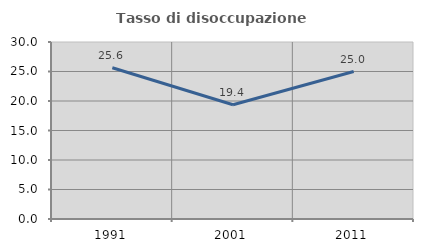
| Category | Tasso di disoccupazione giovanile  |
|---|---|
| 1991.0 | 25.641 |
| 2001.0 | 19.355 |
| 2011.0 | 25 |